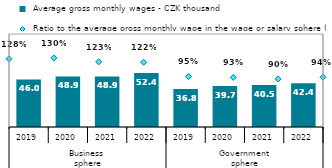
| Category |  Average gross monthly wages - CZK thousand |
|---|---|
| 0 | 45.999 |
| 1 | 48.906 |
| 2 | 48.923 |
| 3 | 52.368 |
| 4 | 36.802 |
| 5 | 39.692 |
| 6 | 40.527 |
| 7 | 42.379 |